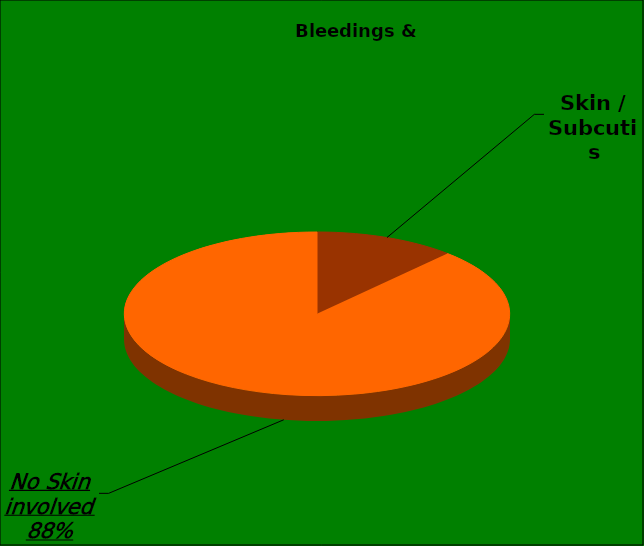
| Category | Series 0 |
|---|---|
| Skin / Subcutis | 79 |
| No Skin involved | 590 |